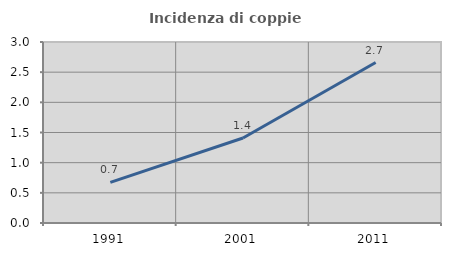
| Category | Incidenza di coppie miste |
|---|---|
| 1991.0 | 0.673 |
| 2001.0 | 1.408 |
| 2011.0 | 2.66 |